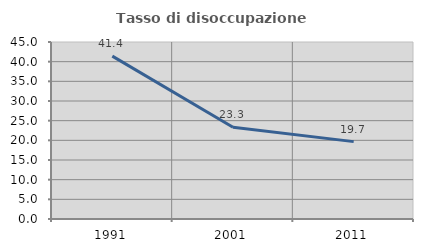
| Category | Tasso di disoccupazione giovanile  |
|---|---|
| 1991.0 | 41.401 |
| 2001.0 | 23.333 |
| 2011.0 | 19.672 |